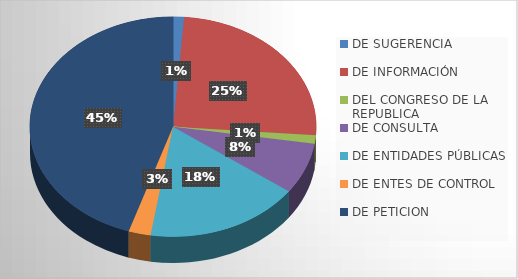
| Category | Series 0 |
|---|---|
| DE SUGERENCIA | 1 |
| DE INFORMACIÓN | 20 |
| DEL CONGRESO DE LA REPUBLICA | 1 |
| DE CONSULTA | 6 |
| DE ENTIDADES PÚBLICAS | 14 |
| DE ENTES DE CONTROL | 2 |
| DE PETICION | 36 |